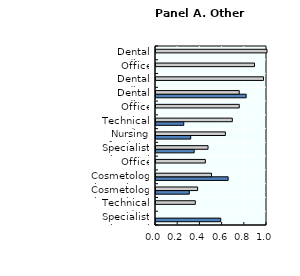
| Category | physical | reasoning/language |
|---|---|---|
| Specialist in Metal Technology Task 2 | 0.583 | 0 |
| Technical Product Designer Task 1 | 0 | 0.354 |
| Cosmetologist Task 1 – Chemical Waving | 0.3 | 0.375 |
| Cosmetologist Task 2 – Manicure | 0.65 | 0.5 |
| Office Management Assistant Task 1.1 | 0 | 0.444 |
| Specialist in Metal Technology Task 1 | 0.344 | 0.469 |
| Nursing Professional | 0.312 | 0.625 |
| Technical Product Designer Task 2 | 0.25 | 0.688 |
| Office Management Assistant Task 1.2 | 0 | 0.75 |
| Dental Medical Assistant Task 2 | 0.812 | 0.75 |
| Dental Medical Assistant Task 1.2 | 0 | 0.969 |
| Office Management Assistant Task 2 | 0 | 0.888 |
| Dental Medical Assistant Task 1.1 | 0 | 1 |